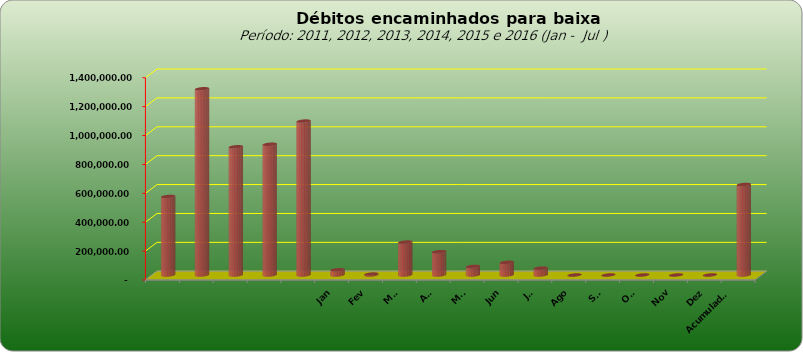
| Category |  543.796,20  |
|---|---|
|  | 543796.2 |
|  | 1289053.69 |
|  | 887573.08 |
|  | 905052.31 |
|  | 1065434.28 |
| Jan | 35964.03 |
| Fev | 6417.54 |
| Mar | 227804.72 |
| Abr | 161576.79 |
| Mai | 59557.82 |
| Jun | 87752.76 |
| Jul | 47447.42 |
| Ago | 0 |
| Set | 0 |
| Out | 0 |
| Nov | 0 |
| Dez | 0 |
| Acumulado
2016 | 626521.08 |